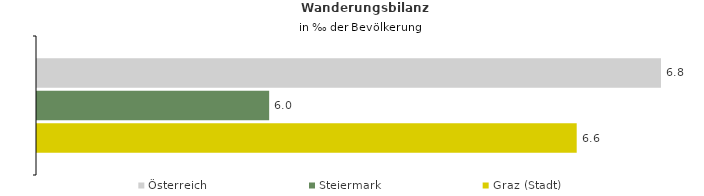
| Category | Österreich | Steiermark | Graz (Stadt) |
|---|---|---|---|
| Wanderungsrate in ‰ der Bevölkerung, Periode 2018-2022 | 6.822 | 5.992 | 6.643 |